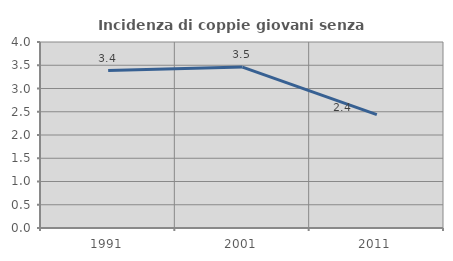
| Category | Incidenza di coppie giovani senza figli |
|---|---|
| 1991.0 | 3.386 |
| 2001.0 | 3.46 |
| 2011.0 | 2.436 |